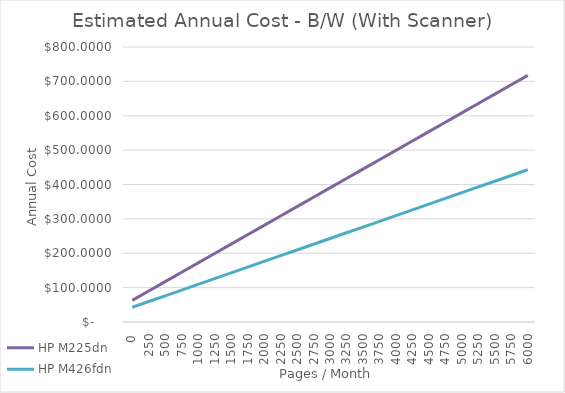
| Category | HP M225dn | HP M426fdn |
|---|---|---|
| 0.0 | 63 | 42.857 |
| 250.0 | 90.273 | 59.524 |
| 500.0 | 117.545 | 76.19 |
| 750.0 | 144.818 | 92.857 |
| 1000.0 | 172.091 | 109.524 |
| 1250.0 | 199.364 | 126.19 |
| 1500.0 | 226.636 | 142.857 |
| 1750.0 | 253.909 | 159.524 |
| 2000.0 | 281.182 | 176.19 |
| 2250.0 | 308.455 | 192.857 |
| 2500.0 | 335.727 | 209.524 |
| 2750.0 | 363 | 226.19 |
| 3000.0 | 390.273 | 242.857 |
| 3250.0 | 417.545 | 259.524 |
| 3500.0 | 444.818 | 276.19 |
| 3750.0 | 472.091 | 292.857 |
| 4000.0 | 499.364 | 309.524 |
| 4250.0 | 526.636 | 326.19 |
| 4500.0 | 553.909 | 342.857 |
| 4750.0 | 581.182 | 359.524 |
| 5000.0 | 608.455 | 376.19 |
| 5250.0 | 635.727 | 392.857 |
| 5500.0 | 663 | 409.524 |
| 5750.0 | 690.273 | 426.19 |
| 6000.0 | 717.545 | 442.857 |